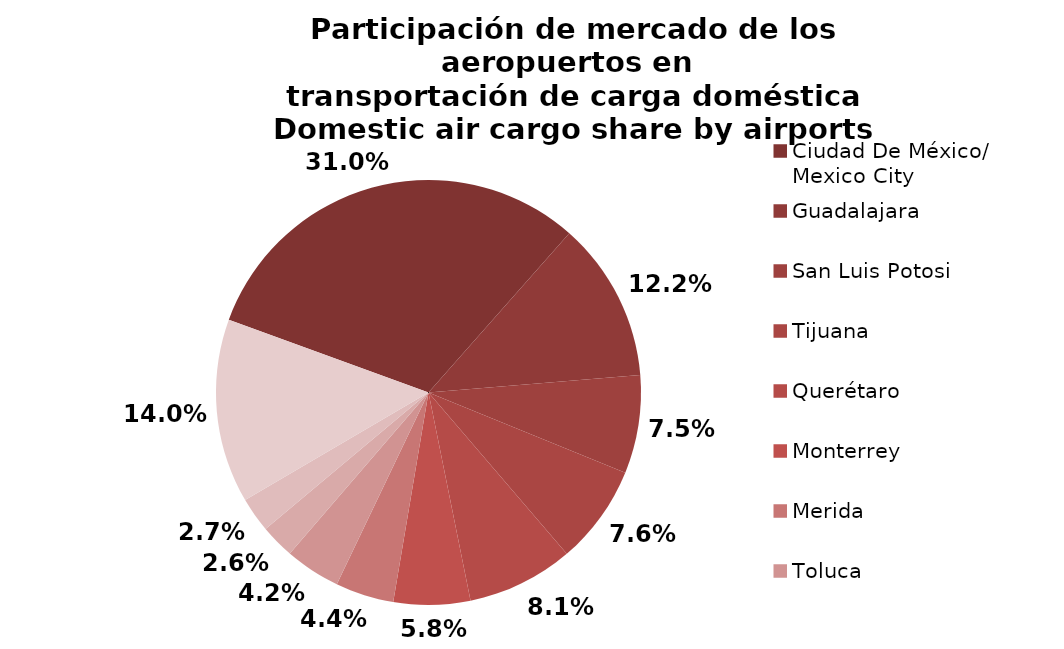
| Category | Series 0 |
|---|---|
| Ciudad De México/
Mexico City | 8673.96 |
| Guadalajara | 3407.6 |
| San Luis Potosi | 2091.676 |
| Tijuana | 2118.536 |
| Querétaro | 2269.03 |
| Monterrey | 1632.428 |
| Merida | 1245.103 |
| Toluca | 1181.494 |
| Cancun | 724.523 |
| Hermosillo | 744.149 |
| Otros/Others | 3918.666 |